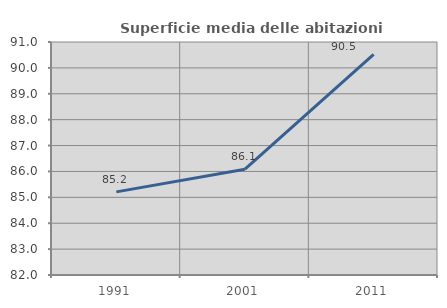
| Category | Superficie media delle abitazioni occupate |
|---|---|
| 1991.0 | 85.21 |
| 2001.0 | 86.086 |
| 2011.0 | 90.518 |